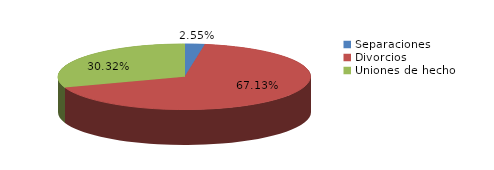
| Category | Series 0 |
|---|---|
| Separaciones | 33 |
| Divorcios | 868 |
| Uniones de hecho | 392 |